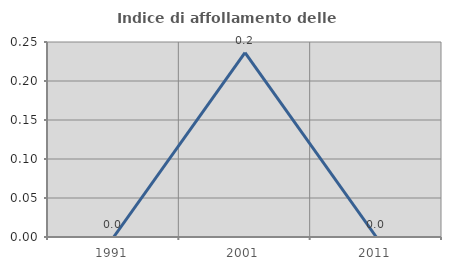
| Category | Indice di affollamento delle abitazioni  |
|---|---|
| 1991.0 | 0 |
| 2001.0 | 0.236 |
| 2011.0 | 0 |